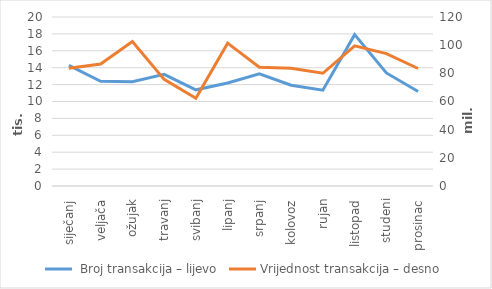
| Category |  Broj transakcija – lijevo |
|---|---|
| siječanj | 14270 |
| veljača | 12400 |
| ožujak | 12334 |
| travanj | 13206 |
| svibanj | 11381 |
| lipanj | 12189 |
| srpanj | 13270 |
| kolovoz | 11921 |
| rujan | 11342 |
| listopad | 17913 |
| studeni | 13381 |
| prosinac | 11185 |